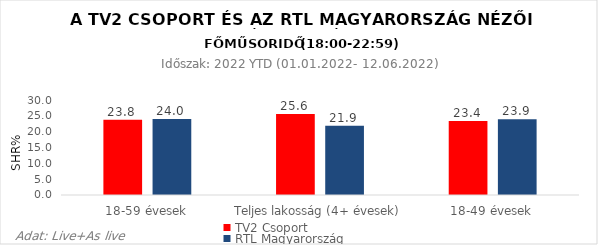
| Category | TV2 Csoport | RTL Magyarország |
|---|---|---|
| 18-59 évesek | 23.8 | 24 |
| Teljes lakosság (4+ évesek) | 25.6 | 21.9 |
| 18-49 évesek | 23.4 | 23.9 |